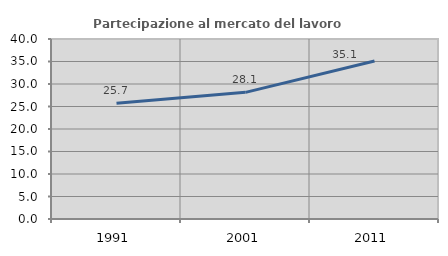
| Category | Partecipazione al mercato del lavoro  femminile |
|---|---|
| 1991.0 | 25.743 |
| 2001.0 | 28.141 |
| 2011.0 | 35.106 |